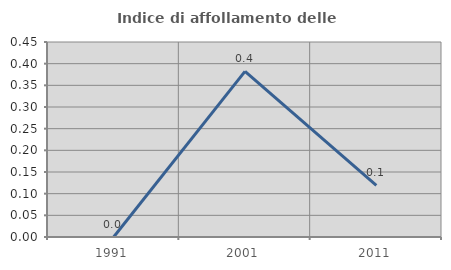
| Category | Indice di affollamento delle abitazioni  |
|---|---|
| 1991.0 | 0 |
| 2001.0 | 0.382 |
| 2011.0 | 0.119 |